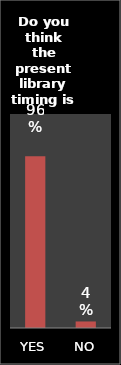
| Category | Series 0 |
|---|---|
| YES | 0.963 |
| NO | 0.037 |